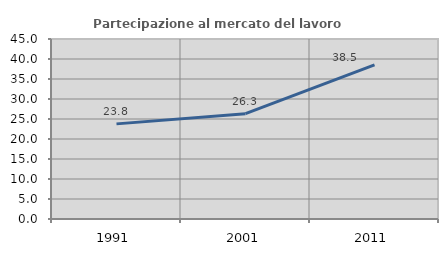
| Category | Partecipazione al mercato del lavoro  femminile |
|---|---|
| 1991.0 | 23.781 |
| 2001.0 | 26.336 |
| 2011.0 | 38.531 |